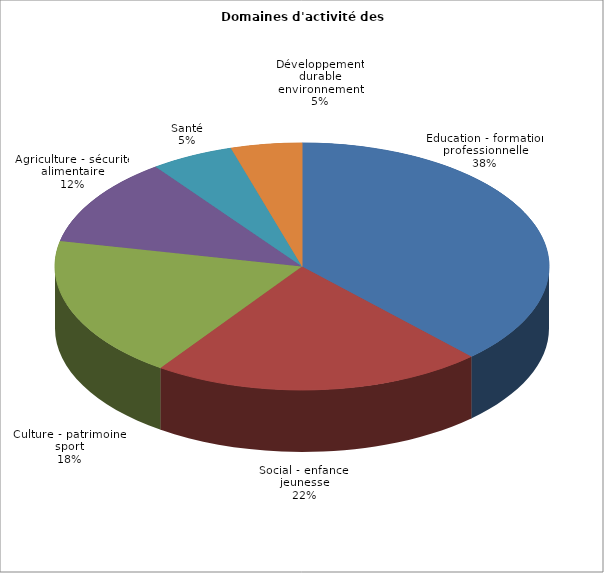
| Category | nombre de projets | % |
|---|---|---|
| Education - formation professionnelle | 49 | 0.38 |
| Social - enfance - jeunesse | 28 | 0.217 |
| Culture - patrimoine - sport | 24 | 0.186 |
| Agriculture - sécurité alimentaire | 15 | 0.116 |
| Santé | 7 | 0.054 |
| Développement durable - environnement | 6 | 0.047 |